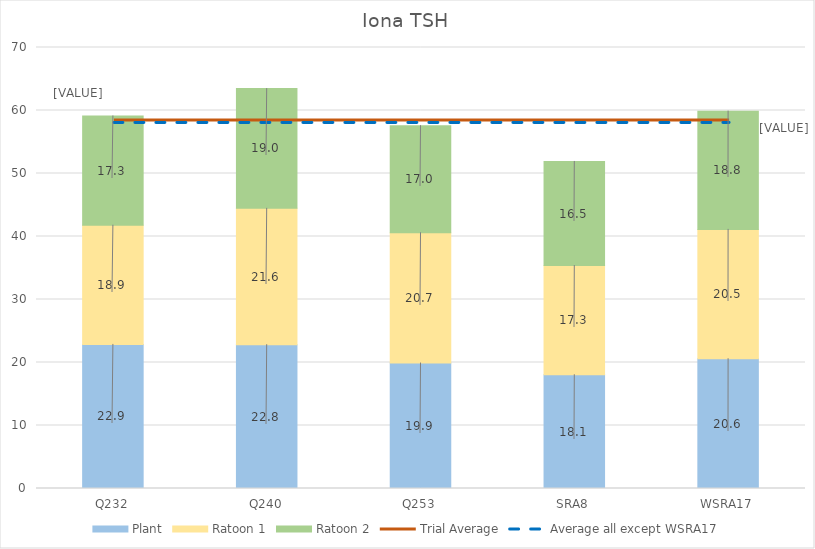
| Category | Plant | Ratoon 1 | Ratoon 2 |
|---|---|---|---|
| Q232 | 22.87 | 18.917 | 17.343 |
| Q240 | 22.825 | 21.64 | 19.008 |
| Q253 | 19.916 | 20.673 | 16.999 |
| SRA8 | 18.055 | 17.335 | 16.52 |
| WSRA17 | 20.598 | 20.532 | 18.766 |